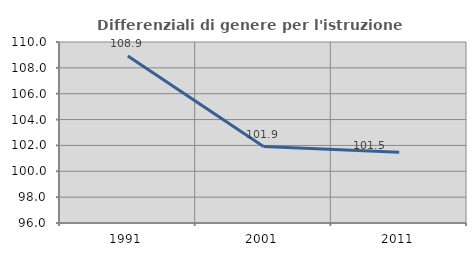
| Category | Differenziali di genere per l'istruzione superiore |
|---|---|
| 1991.0 | 108.914 |
| 2001.0 | 101.917 |
| 2011.0 | 101.481 |